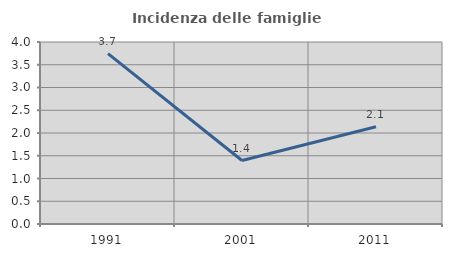
| Category | Incidenza delle famiglie numerose |
|---|---|
| 1991.0 | 3.743 |
| 2001.0 | 1.395 |
| 2011.0 | 2.137 |